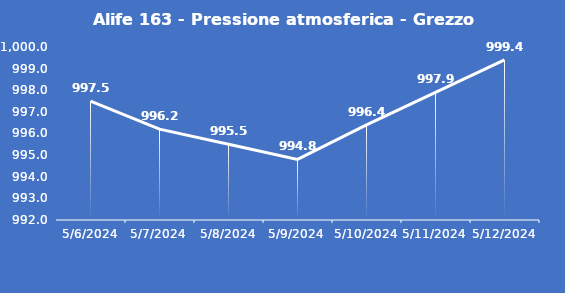
| Category | Alife 163 - Pressione atmosferica - Grezzo (hPa) |
|---|---|
| 5/6/24 | 997.5 |
| 5/7/24 | 996.2 |
| 5/8/24 | 995.5 |
| 5/9/24 | 994.8 |
| 5/10/24 | 996.4 |
| 5/11/24 | 997.9 |
| 5/12/24 | 999.4 |